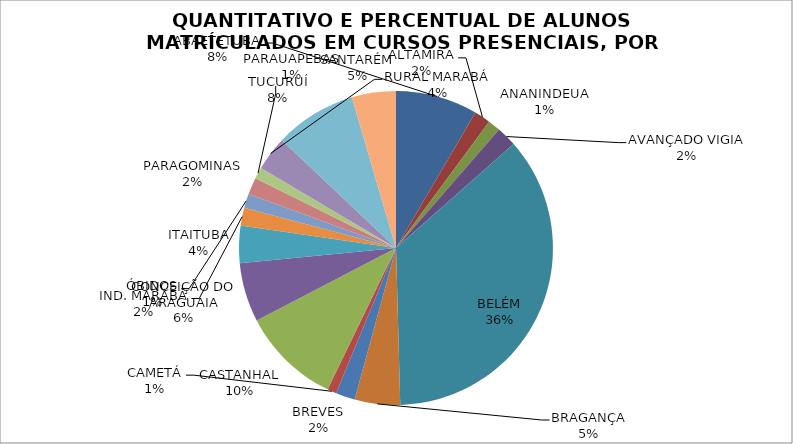
| Category | QUANTITATIVO E PERCENTUAL DE ALUNOS MATRÍCULADOS EM CURSOS PRESENCIAIS, POR CAMPUS, NO ANO LETIVO DE 2015. |
|---|---|
| ABAETETUBA | 8.445 |
| ALTAMIRA | 1.665 |
| ANANINDEUA | 1.29 |
| AVANÇADO VIGIA | 2.076 |
| BELÉM | 36.09 |
| BRAGANÇA | 4.68 |
| BREVES | 1.982 |
| CAMETÁ | 0.938 |
| CASTANHAL | 10.204 |
| CONCEIÇÃO DO ARAGUAIA | 6.087 |
| ITAITUBA | 3.824 |
| IND. MARABÁ | 1.841 |
| ÓBIDOS | 1.454 |
| PARAGOMINAS | 1.759 |
| PARAUAPEBAS | 1.173 |
| RURAL MARABÁ | 3.542 |
| TUCURUÍ | 8.41 |
| SANTARÉM | 4.539 |